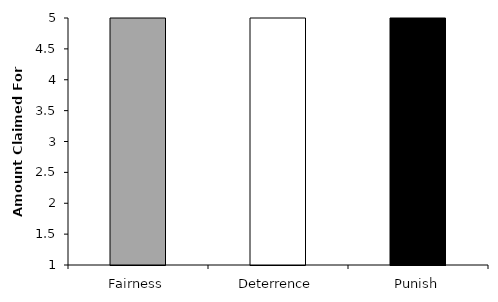
| Category | Series 0 |
|---|---|
| _x0008_Fairness | 5.45 |
| 
Deterrence | 6 |
| _x0006_Punish | 6.86 |